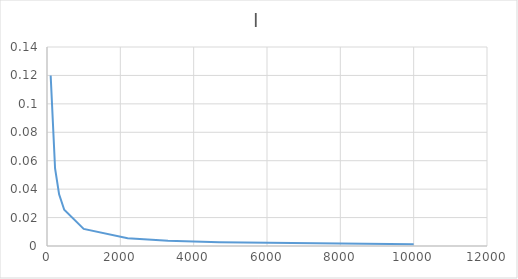
| Category | I |
|---|---|
| 100.0 | 0.12 |
| 220.0 | 0.055 |
| 330.0 | 0.036 |
| 470.0 | 0.026 |
| 1000.0 | 0.012 |
| 2200.0 | 0.005 |
| 3300.0 | 0.004 |
| 4700.0 | 0.003 |
| 10000.0 | 0.001 |